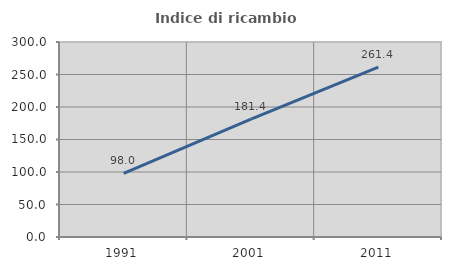
| Category | Indice di ricambio occupazionale  |
|---|---|
| 1991.0 | 98.02 |
| 2001.0 | 181.429 |
| 2011.0 | 261.429 |